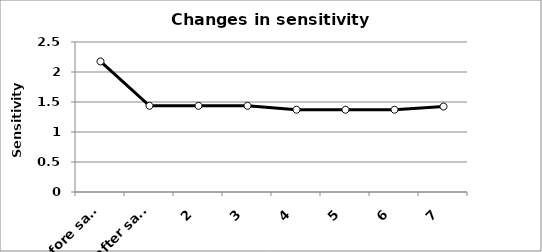
| Category | Sensitivity [V/µM] |
|---|---|
| 0 (before sample) | 2.176 |
| 1 (after sample) | 1.437 |
| 2 | 1.437 |
| 3 | 1.437 |
| 4 | 1.371 |
| 5 | 1.371 |
| 6 | 1.371 |
| 7 | 1.425 |